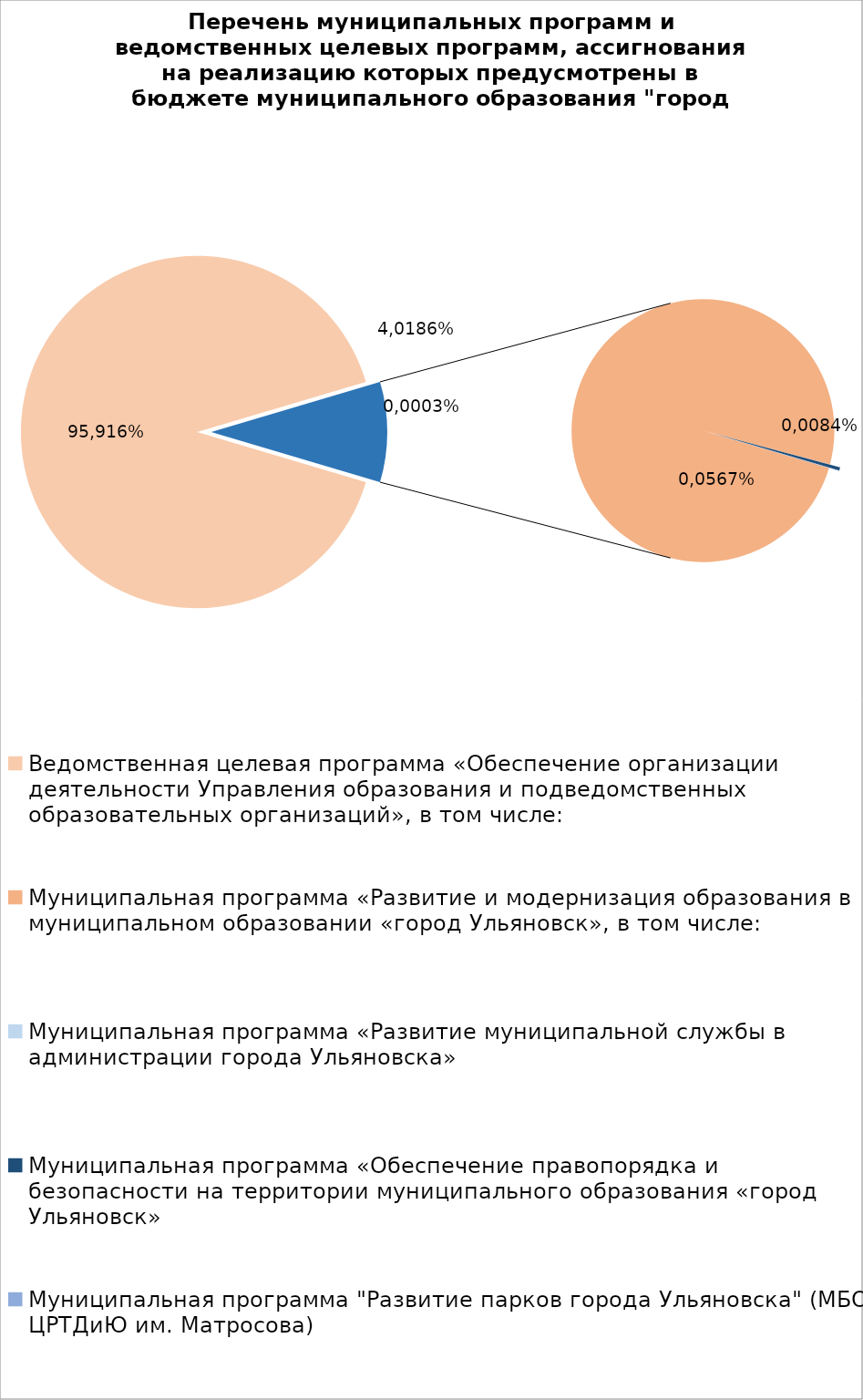
| Category | Series 0 |
|---|---|
| Ведомственная целевая программа «Обеспечение организации деятельности Управления образования и подведомственных образовательных организаций», в том числе: | 6904575.03 |
| Муниципальная программа «Развитие и модернизация образования в муниципальном образовании «город Ульяновск», в том числе: | 695727.36 |
| Муниципальная программа «Развитие муниципальной службы в администрации города Ульяновска» | 14.3 |
| Муниципальная программа «Обеспечение правопорядка и безопасности на территории муниципального образования «город Ульяновск» | 2700 |
| Муниципальная программа "Развитие парков города Ульяновска" (МБОУ ЦРТДиЮ им. Матросова) | 400 |